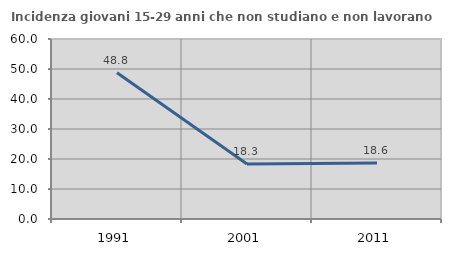
| Category | Incidenza giovani 15-29 anni che non studiano e non lavorano  |
|---|---|
| 1991.0 | 48.783 |
| 2001.0 | 18.332 |
| 2011.0 | 18.644 |